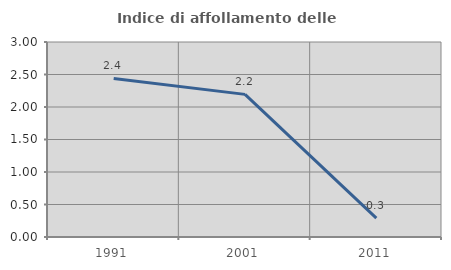
| Category | Indice di affollamento delle abitazioni  |
|---|---|
| 1991.0 | 2.439 |
| 2001.0 | 2.194 |
| 2011.0 | 0.292 |